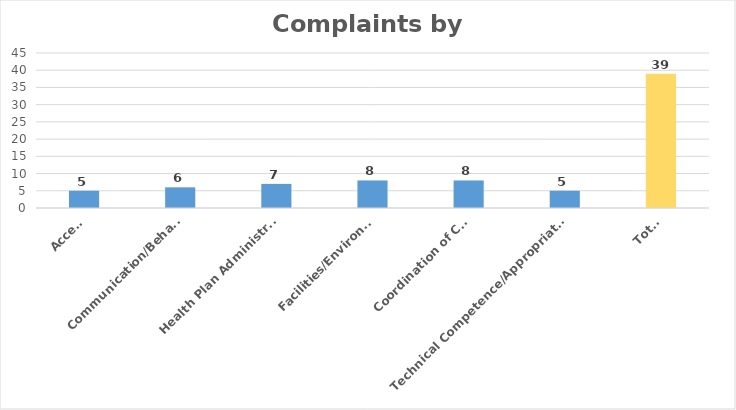
| Category | Count |
|---|---|
| Access | 5 |
| Communication/Behavior | 6 |
| Health Plan Administration | 7 |
| Facilities/Environment | 8 |
| Coordination of Care | 8 |
| Technical Competence/Appropriateness | 5 |
| Total | 39 |